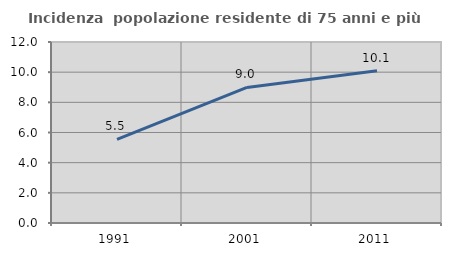
| Category | Incidenza  popolazione residente di 75 anni e più |
|---|---|
| 1991.0 | 5.54 |
| 2001.0 | 8.99 |
| 2011.0 | 10.101 |